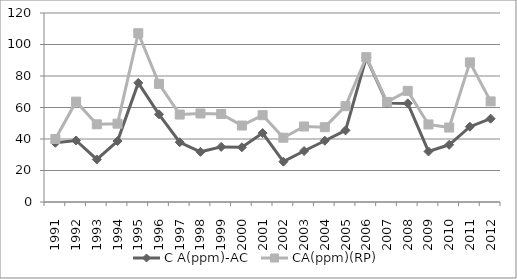
| Category | C A(ppm)-AC | CA(ppm)(RP) |
|---|---|---|
| 1991.0 | 37.603 | 39.985 |
| 1992.0 | 39.039 | 63.713 |
| 1993.0 | 27.023 | 49.331 |
| 1994.0 | 38.684 | 49.72 |
| 1995.0 | 75.628 | 107.154 |
| 1996.0 | 55.686 | 75.011 |
| 1997.0 | 37.941 | 55.517 |
| 1998.0 | 31.857 | 56.209 |
| 1999.0 | 34.983 | 55.897 |
| 2000.0 | 34.73 | 48.545 |
| 2001.0 | 43.771 | 55.136 |
| 2002.0 | 25.604 | 40.814 |
| 2003.0 | 32.364 | 47.954 |
| 2004.0 | 38.87 | 47.506 |
| 2005.0 | 45.461 | 60.84 |
| 2006.0 | 91.699 | 91.97 |
| 2007.0 | 62.868 | 63.544 |
| 2008.0 | 62.615 | 70.558 |
| 2009.0 | 32.093 | 49.23 |
| 2010.0 | 36.318 | 47.269 |
| 2011.0 | 47.793 | 88.64 |
| 2012.0 | 52.914 | 63.865 |